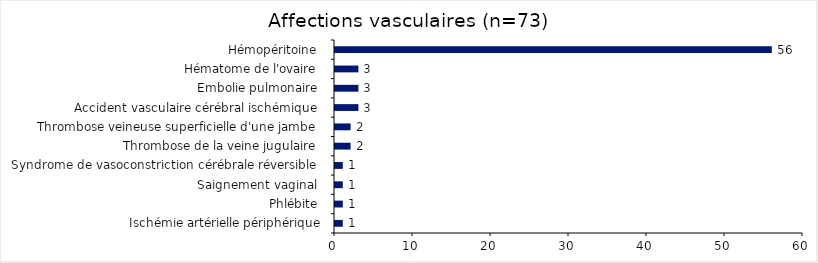
| Category | Series 0 |
|---|---|
| Ischémie artérielle périphérique | 1 |
| Phlébite  | 1 |
| Saignement vaginal  | 1 |
| Syndrome de vasoconstriction cérébrale réversible  | 1 |
| Thrombose de la veine jugulaire  | 2 |
| Thrombose veineuse superficielle d'une jambe  | 2 |
| Accident vasculaire cérébral ischémique  | 3 |
| Embolie pulmonaire  | 3 |
| Hématome de l'ovaire  | 3 |
| Hémopéritoine  | 56 |